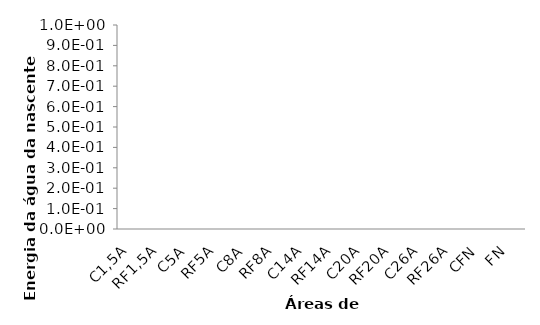
| Category | Series 0 |
|---|---|
| C1,5A | 0 |
| RF1,5A | 0 |
| C5A | 0 |
| RF5A | 0 |
| C8A | 0 |
| RF8A | 0 |
| C14A | 0 |
| RF14A | 0 |
| C20A | 0 |
| RF20A | 0 |
| C26A | 0 |
| RF26A | 0 |
| CFN | 0 |
| FN | 0 |